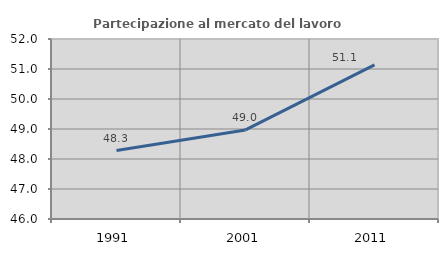
| Category | Partecipazione al mercato del lavoro  femminile |
|---|---|
| 1991.0 | 48.28 |
| 2001.0 | 48.97 |
| 2011.0 | 51.137 |